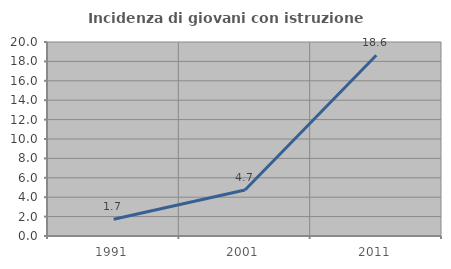
| Category | Incidenza di giovani con istruzione universitaria |
|---|---|
| 1991.0 | 1.724 |
| 2001.0 | 4.737 |
| 2011.0 | 18.638 |